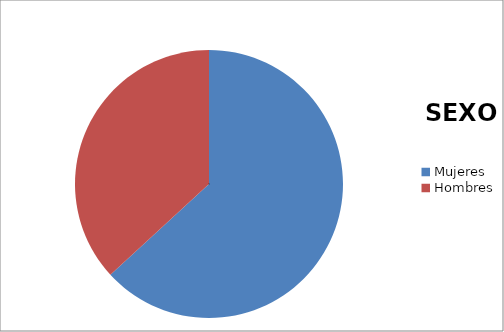
| Category | Series 0 |
|---|---|
| Mujeres | 48 |
| Hombres | 28 |